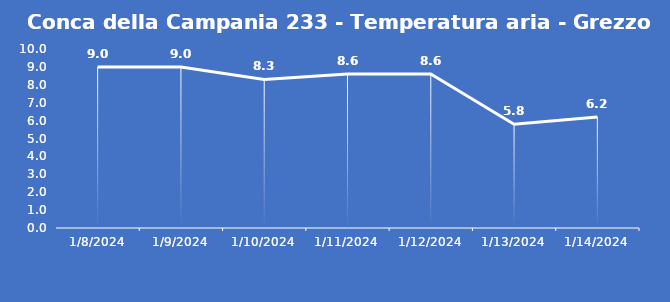
| Category | Conca della Campania 233 - Temperatura aria - Grezzo (°C) |
|---|---|
| 1/8/24 | 9 |
| 1/9/24 | 9 |
| 1/10/24 | 8.3 |
| 1/11/24 | 8.6 |
| 1/12/24 | 8.6 |
| 1/13/24 | 5.8 |
| 1/14/24 | 6.2 |